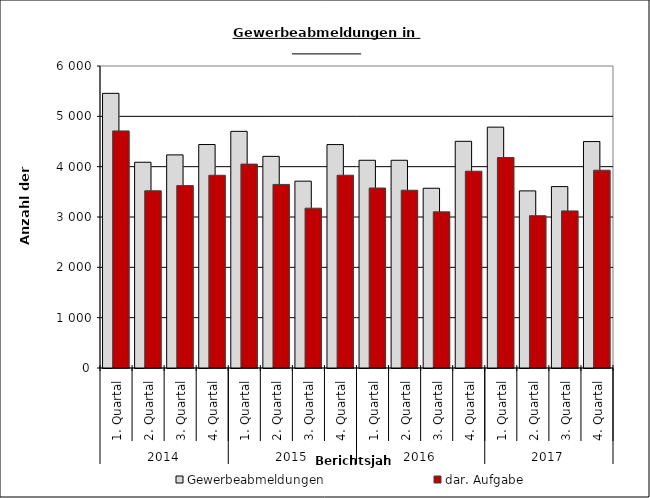
| Category | Gewerbeabmeldungen | dar. Aufgabe |
|---|---|---|
| 0 | 5457 | 4710 |
| 1 | 4088 | 3521 |
| 2 | 4234 | 3624 |
| 3 | 4440 | 3829 |
| 4 | 4702 | 4051 |
| 5 | 4205 | 3647 |
| 6 | 3712 | 3175 |
| 7 | 4439 | 3830 |
| 8 | 4127 | 3576 |
| 9 | 4127 | 3532 |
| 10 | 3571 | 3102 |
| 11 | 4504 | 3910 |
| 12 | 4785 | 4182 |
| 13 | 3519 | 3026 |
| 14 | 3604 | 3121 |
| 15 | 4499 | 3930 |